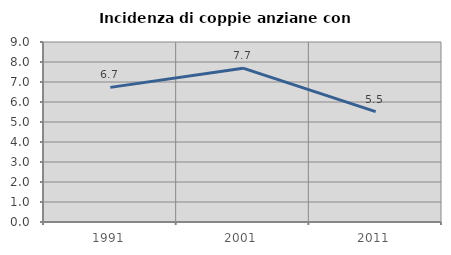
| Category | Incidenza di coppie anziane con figli |
|---|---|
| 1991.0 | 6.731 |
| 2001.0 | 7.692 |
| 2011.0 | 5.517 |